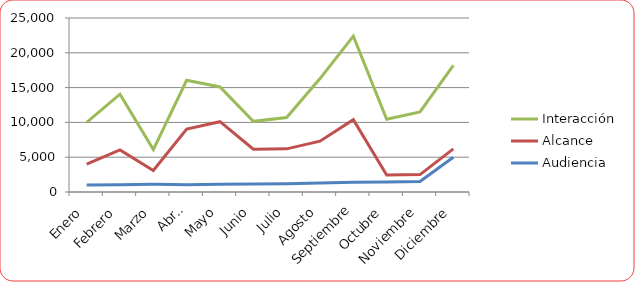
| Category | Audiencia | Alcance | Interacción |
|---|---|---|---|
| Enero | 1000 | 3000 | 6000 |
| Febrero | 1050 | 5000 | 8000 |
| Marzo | 1100 | 2000 | 3000 |
| Abril | 1050 | 8000 | 7000 |
| Mayo | 1100 | 9000 | 5000 |
| Junio | 1150 | 5000 | 4000 |
| Julio | 1200 | 5000 | 4500 |
| Agosto | 1300 | 6000 | 9000 |
| Septiembre | 1400 | 9000 | 12000 |
| Octubre | 1450 | 1000 | 8000 |
| Noviembre | 1500 | 1000 | 9000 |
| Diciembre | 5000 | 1200 | 12000 |